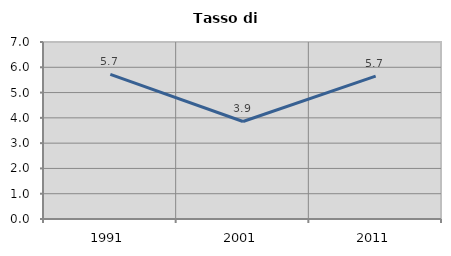
| Category | Tasso di disoccupazione   |
|---|---|
| 1991.0 | 5.723 |
| 2001.0 | 3.856 |
| 2011.0 | 5.652 |